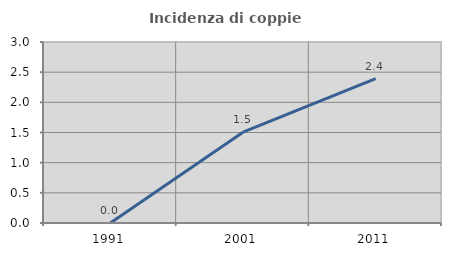
| Category | Incidenza di coppie miste |
|---|---|
| 1991.0 | 0 |
| 2001.0 | 1.504 |
| 2011.0 | 2.394 |